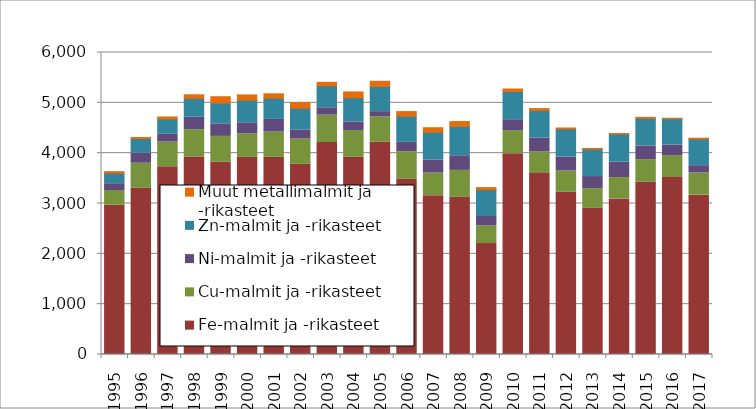
| Category | Fe-malmit ja -rikasteet | Cu-malmit ja -rikasteet | Ni-malmit ja -rikasteet | Zn-malmit ja -rikasteet | Muut metallimalmit ja -rikasteet |
|---|---|---|---|---|---|
| 1995.0 | 2964991 | 293676 | 134831 | 211074 | 27802 |
| 1996.0 | 3305768 | 494217 | 200610 | 288603 | 22806 |
| 1997.0 | 3732023 | 487477 | 163962 | 295485 | 40700 |
| 1998.0 | 3922531 | 544111 | 247276 | 375432 | 71235 |
| 1999.0 | 3818566 | 514879 | 249028 | 411447 | 127706 |
| 2000.0 | 3917135 | 468557 | 217154 | 448698 | 105879 |
| 2001.0 | 3916207 | 503460 | 250973 | 422274 | 86600 |
| 2002.0 | 3778578 | 500798 | 178968 | 433196 | 112407 |
| 2003.0 | 4212158 | 543488 | 146122 | 436345 | 69267 |
| 2004.0 | 3921507 | 528930 | 169170 | 479603 | 117553 |
| 2005.0 | 4215633 | 504658 | 104983 | 499024 | 103122 |
| 2006.0 | 3481019 | 544149 | 190233 | 520081 | 90806 |
| 2007.0 | 3156096 | 448119 | 256932 | 555569 | 88572 |
| 2008.0 | 3121303 | 536584 | 290914 | 582049 | 97004 |
| 2009.0 | 2204018.428 | 352369.847 | 185201.501 | 532036.35 | 42403 |
| 2010.0 | 3989432.193 | 458174.471 | 217164.181 | 559918.304 | 50387 |
| 2011.0 | 3608822 | 415365 | 276892 | 547405 | 36734 |
| 2012.0 | 3220998 | 424982 | 276587 | 558963 | 18559 |
| 2013.0 | 2903192 | 391822 | 240116 | 546121 | 12681 |
| 2014.0 | 3091631 | 423149 | 307179 | 557447 | 9536 |
| 2015.0 | 3425061 | 447546 | 269701 | 550344 | 18970 |
| 2016.0 | 3516035 | 435927.515 | 209219 | 521900 | 10661.644 |
| 2017.0 | 3166038.389 | 440644.406 | 144848.274 | 528832.702 | 17209.207 |